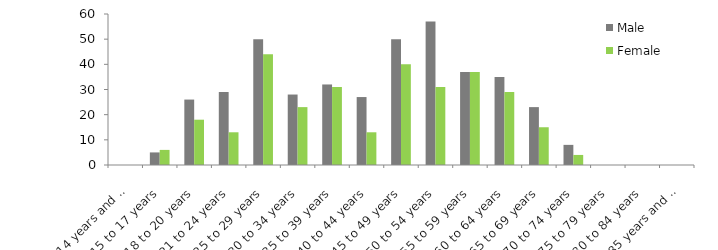
| Category | Male | Female |
|---|---|---|
| 14 years and under | 0 | 0 |
| 15 to 17 years | 5 | 6 |
| 18 to 20 years | 26 | 18 |
| 21 to 24 years | 29 | 13 |
| 25 to 29 years | 50 | 44 |
| 30 to 34 years | 28 | 23 |
| 35 to 39 years | 32 | 31 |
| 40 to 44 years | 27 | 13 |
| 45 to 49 years | 50 | 40 |
| 50 to 54 years | 57 | 31 |
| 55 to 59 years | 37 | 37 |
| 60 to 64 years | 35 | 29 |
| 65 to 69 years | 23 | 15 |
| 70 to 74 years | 8 | 4 |
| 75 to 79 years | 0 | 0 |
| 80 to 84 years | 0 | 0 |
| 85 years and over | 0 | 0 |